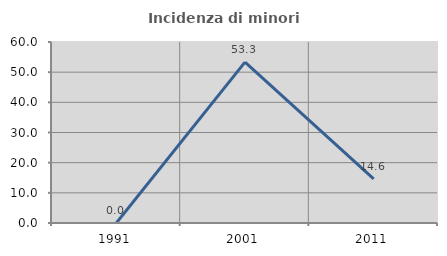
| Category | Incidenza di minori stranieri |
|---|---|
| 1991.0 | 0 |
| 2001.0 | 53.333 |
| 2011.0 | 14.634 |